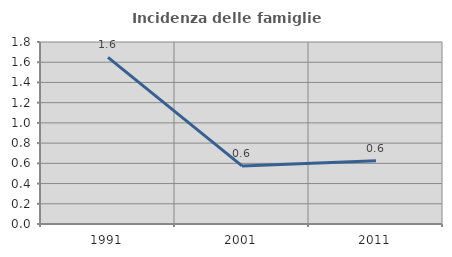
| Category | Incidenza delle famiglie numerose |
|---|---|
| 1991.0 | 1.648 |
| 2001.0 | 0.575 |
| 2011.0 | 0.625 |